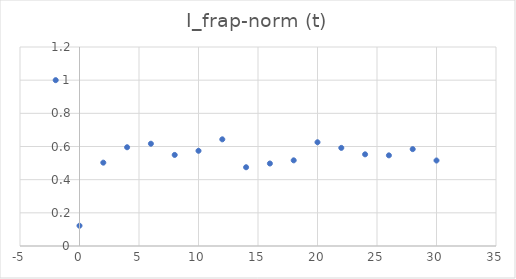
| Category | I_frap-norm (t) |
|---|---|
| -2.0 | 1 |
| 0.0 | 0.122 |
| 2.0 | 0.503 |
| 4.0 | 0.595 |
| 6.0 | 0.617 |
| 8.0 | 0.549 |
| 10.0 | 0.574 |
| 12.0 | 0.643 |
| 14.0 | 0.475 |
| 16.0 | 0.497 |
| 18.0 | 0.517 |
| 20.0 | 0.626 |
| 22.0 | 0.592 |
| 24.0 | 0.553 |
| 26.0 | 0.547 |
| 28.0 | 0.584 |
| 30.0 | 0.516 |